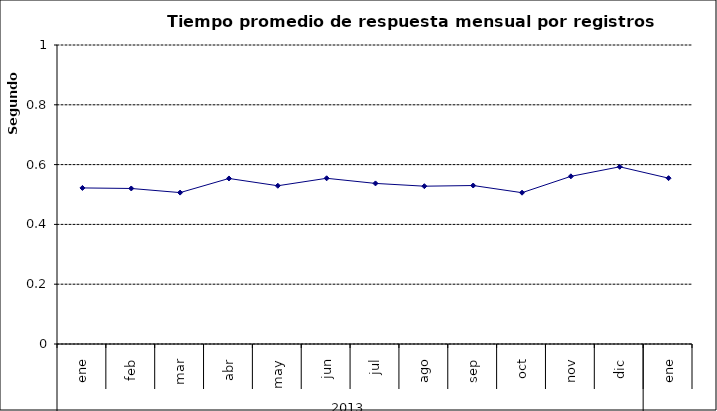
| Category | Tiempo promedio de respuesta por registros cámara PH ** |
|---|---|
| 0 | 0.522 |
| 1 | 0.52 |
| 2 | 0.506 |
| 3 | 0.554 |
| 4 | 0.529 |
| 5 | 0.554 |
| 6 | 0.537 |
| 7 | 0.528 |
| 8 | 0.53 |
| 9 | 0.506 |
| 10 | 0.561 |
| 11 | 0.593 |
| 12 | 0.555 |